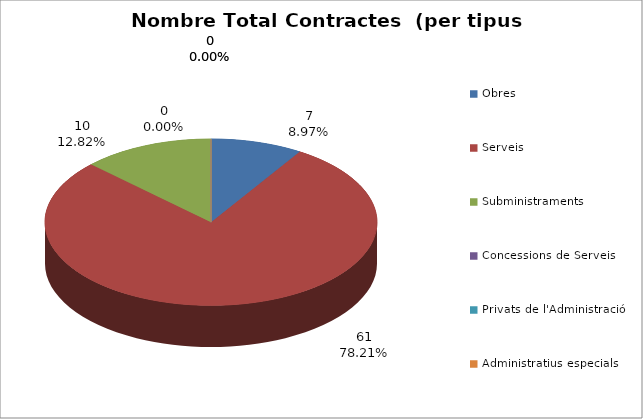
| Category | Nombre Total Contractes |
|---|---|
| Obres | 7 |
| Serveis | 61 |
| Subministraments | 10 |
| Concessions de Serveis | 0 |
| Privats de l'Administració | 0 |
| Administratius especials | 0 |